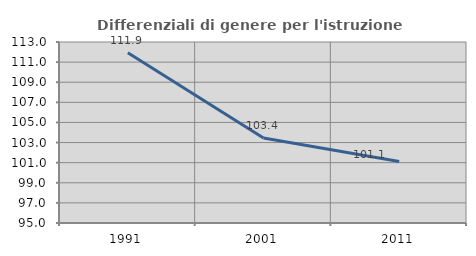
| Category | Differenziali di genere per l'istruzione superiore |
|---|---|
| 1991.0 | 111.922 |
| 2001.0 | 103.447 |
| 2011.0 | 101.113 |